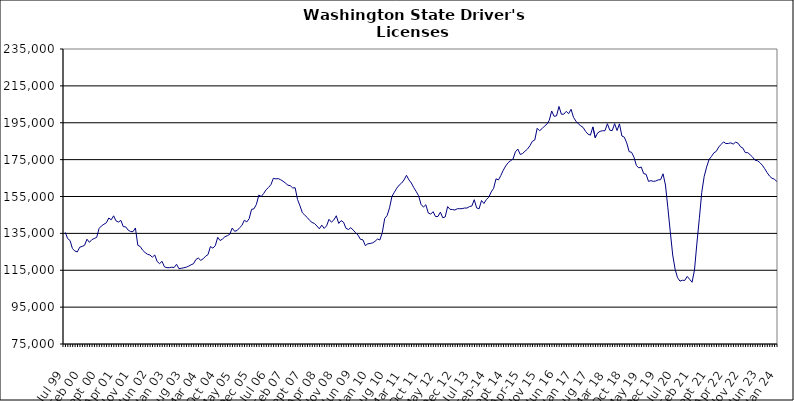
| Category | Series 0 |
|---|---|
| Jul 99 | 135560 |
| Aug 99 | 132182 |
| Sep 99 | 131104 |
| Oct 99 | 126694 |
| Nov 99 | 125425 |
| Dec 99 | 124927 |
| Jan 00 | 127499 |
| Feb 00 | 127927 |
| Mar 00 | 128547 |
| Apr 00 | 131834 |
| May 00 | 130120 |
| Jun 00 | 131595 |
| Jul 00 | 132236 |
| Aug 00 | 132819 |
| Sep 00 | 137711 |
| Oct 00 | 139063 |
| Nov 00 | 139952 |
| Dec 00 | 140732 |
| Jan 01 | 143338 |
| Feb 01 | 142359 |
| Mar 01 | 144523 |
| Apr 01 | 141758 |
| May 01 | 141135 |
| Jun 01 | 142064 |
| Jul 01 | 138646 |
| Aug 01 | 138530 |
| Sep 01 | 136784 |
| Oct 01 | 135996 |
| Nov 01 | 135917 |
| Dec 01 | 137940 |
| Jan 02 | 128531 |
| Feb 02 | 127848 |
| Mar 02 | 125876 |
| Apr 02 | 124595 |
| May 02 | 123660 |
| Jun 02 | 123282 |
| Jul 02 | 122089 |
| Aug 02 | 123279 |
| Sep 02 | 119727 |
| Oct 02 | 118588 |
| Nov 02 | 119854 |
| Dec 02 | 116851 |
| Jan 03 | 116407 |
| Feb 03 | 116382 |
| Mar 03 | 116648 |
| Apr 03 | 116471 |
| May 03 | 118231 |
| Jun 03 | 115831 |
| Jul 03 | 116082 |
| Aug 03 | 116341 |
| Sep 03 | 116653 |
| Oct 03 | 117212 |
| Nov 03 | 117962 |
| Dec 03 | 118542 |
| Jan 04 | 120817 |
| Feb 04 | 121617 |
| Mar 04 | 120369 |
| Apr 04 | 121200 |
| May 04 | 122609 |
| Jun 04 | 123484 |
| Jul 04 | 127844 |
| Aug 04 | 127025 |
| Sep 04 | 128273 |
| Oct 04 | 132853 |
| Nov 04 | 131106 |
| Dec 04 | 131935 |
| Jan 05 | 133205 |
| Feb 05 | 133736 |
| Mar 05 | 134528 |
| Apr 05 | 137889 |
| May 05 | 136130 |
| Jun 05 | 136523 |
| Jul 05 | 137997 |
| Aug 05 | 139294 |
| Sep 05 | 142140 |
| Oct 05 | 141192 |
| Nov 05 | 142937 |
| Dec 05 | 148013 |
| Jan 06 | 148341 |
| Feb 06 | 150744 |
| Mar 06 | 155794 |
| Apr 06 | 154984 |
| May 06 | 156651 |
| Jun 06 | 158638 |
| Jul 06 | 159911 |
| Aug 06 | 161445 |
| Sep 06 | 164852 |
| Oct 06 | 164570 |
| Nov 06 | 164679 |
| Dec 06 | 164127 |
| Jan 07 | 163271 |
| Feb 07 | 162273 |
| Mar 07 | 161140 |
| Apr 07 | 160860 |
| May 07 | 159633 |
| Jun 07 | 159724 |
| Jul 07 | 153303 |
| Aug 07 | 149939 |
| Sep 07 | 146172 |
| Oct 07 | 144876 |
| Nov 07 | 143613 |
| Dec 07 | 142022 |
| Jan 08 | 140909 |
| Feb 08 | 140368 |
| Mar 08 | 138998 |
| Apr 08 | 137471 |
| May 08 | 139453 |
| Jun 08 | 137680 |
| Jul 08 | 139120 |
| Aug 08 | 142612 |
| Sep-08 | 141071 |
| Oct 08 | 142313 |
| Nov 08 | 144556 |
| Dec 08 | 140394 |
| Jan 09 | 141903 |
| Feb 09 | 141036 |
| Mar 09 | 137751 |
| Apr 09 | 137060 |
| May 09 | 138101 |
| Jun 09 | 136739 |
| Jul 09 | 135317 |
| Aug 09 | 134020 |
| Sep 09 | 131756 |
| Oct 09 | 131488 |
| Nov 09 | 128370 |
| Dec 09 | 129323 |
| Jan 10 | 129531 |
| Feb 10 | 129848 |
| Mar 10 | 130654 |
| Apr 10 | 131929 |
| May 10 | 131429 |
| Jun 10 | 135357 |
| Jul 10 | 143032 |
| Aug 10 | 144686 |
| Sep 10 | 148856 |
| Oct 10 | 155042 |
| Nov 10 | 157328 |
| Dec 10 | 159501 |
| Jan 11 | 161221 |
| Feb 11 | 162312 |
| Mar 11 | 163996 |
| Apr 11 | 166495 |
| May 11 | 164040 |
| Jun 11 | 162324 |
| Jul 11 | 159862 |
| Aug 11 | 157738 |
| Sep 11 | 155430 |
| Oct 11 | 150762 |
| Nov 11 | 149255 |
| Dec 11 | 150533 |
| Jan 12 | 146068 |
| Feb 12 | 145446 |
| Mar 12 | 146788 |
| Apr 12 | 144110 |
| May 12 | 144162 |
| Jun 12 | 146482 |
| Jul 12 | 143445 |
| Aug 12 | 143950 |
| Sep 12 | 149520 |
| Oct 12 | 148033 |
| Nov 12 | 147926 |
| Dec 12 | 147674 |
| Jan 13 | 148360 |
| Feb-13 | 148388 |
| Mar-13 | 148414 |
| Apr 13 | 148749 |
| May 13 | 148735 |
| Jun-13 | 149521 |
| Jul 13 | 149837 |
| Aug 13 | 153252 |
| Sep 13 | 148803 |
| Oct 13 | 148315 |
| Nov 13 | 152804 |
| Dec 13 | 151209 |
| Jan 14 | 153357 |
| Feb-14 | 154608 |
| Mar 14 | 157479 |
| Apr 14 | 159441 |
| May 14 | 164591 |
| Jun 14 | 163995 |
| Jul-14 | 166411 |
| Aug-14 | 169272 |
| Sep 14 | 171565 |
| Oct 14 | 173335 |
| Nov 14 | 174406 |
| Dec 14 | 175302 |
| Jan 15 | 179204 |
| Feb 15 | 180737 |
| Mar 15 | 177810 |
| Apr-15 | 178331 |
| May 15 | 179601 |
| Jun-15 | 180729 |
| Jul 15 | 182540 |
| Aug 15 | 184924 |
| Sep 15 | 185620 |
| Oct 15 | 192002 |
| Nov 15 | 190681 |
| Dec 15 | 191795 |
| Jan 16 | 193132 |
| Feb 16 | 194206 |
| Mar 16 | 196319 |
| Apr 16 | 201373 |
| May 16 | 198500 |
| Jun 16 | 198743 |
| Jul 16 | 203841 |
| Aug 16 | 199630 |
| Sep 16 | 199655 |
| Oct 16 | 201181 |
| Nov 16 | 199888 |
| Dec 16 | 202304 |
| Jan 17 | 197977 |
| Feb 17 | 195889 |
| Mar 17 | 194438 |
| Apr 17 | 193335 |
| May 17 | 192430 |
| Jun 17 | 190298 |
| Jul 17 | 188832 |
| Aug 17 | 188264 |
| Sep 17 | 192738 |
| Oct 17 | 186856 |
| Nov 17 | 189537 |
| Dec 17 | 190341 |
| Jan 18 | 190670 |
| Feb 18 | 190645 |
| Mar 18 | 194476 |
| Apr 18 | 190971 |
| May 18 | 190707 |
| Jun 18 | 194516 |
| Jul 18 | 190783 |
| Aug 18 | 194390 |
| Sep 18 | 187831 |
| Oct 18 | 187188 |
| Nov 18 | 184054 |
| Dec 18 | 179347 |
| Jan 19 | 178958 |
| Feb 19 | 176289 |
| Mar 19 | 171747 |
| Apr 19 | 170532 |
| May 19 | 170967 |
| Jun 19 | 167444 |
| Jul 19 | 167059 |
| Aug 19 | 163194 |
| Sep 19 | 163599 |
| Oct 19 | 163212 |
| Nov 19 | 163388 |
| Dec 19 | 164024 |
| Jan 20 | 164114 |
| Feb 20 | 167320 |
| Mar 20 | 161221 |
| Apr 20 | 148866 |
| May 20 | 135821 |
| Jun 20 | 123252 |
| Jul 20 | 115526 |
| Aug 20 | 110940 |
| Sep 20 | 109099 |
| Oct 20 | 109566 |
| Nov 20 | 109488 |
| Dec 20 | 111658 |
| Jan 21 | 110070 |
| Feb 21 | 108491 |
| Mar 21 | 115176 |
| Apr 21 | 129726 |
| May 21 | 143052 |
| Jun 21 | 157253 |
| Jul 21 | 165832 |
| Aug 21 | 170937 |
| Sep 21 | 175042 |
| Oct 21 | 176696 |
| Nov 21 | 178677 |
| Dec 21 | 179501 |
| Jan 22 | 181825 |
| Feb 22 | 183258 |
| Mar 22 | 184618 |
| Apr 22 | 183710 |
| May 22 | 183784 |
| Jun 22 | 184101 |
| Jul 22 | 183443 |
| Aug 22 | 184475 |
| Sep 22 | 183902 |
| Oct 22 | 181994 |
| Nov 22 | 181207 |
| Dec 22 | 178793 |
| Jan 23 | 178782 |
| Feb 23 | 177647 |
| Mar 23 | 176386 |
| Apr 23 | 174729 |
| May 23 | 174390 |
| Jun 23 | 173391 |
| Jul 23 | 171988 |
| Aug 23 | 170100 |
| Sep 23 | 167953 |
| Oct 23 | 166088 |
| Nov 23 | 164934 |
| Dec 23 | 164371 |
| Jan 24 | 163182 |